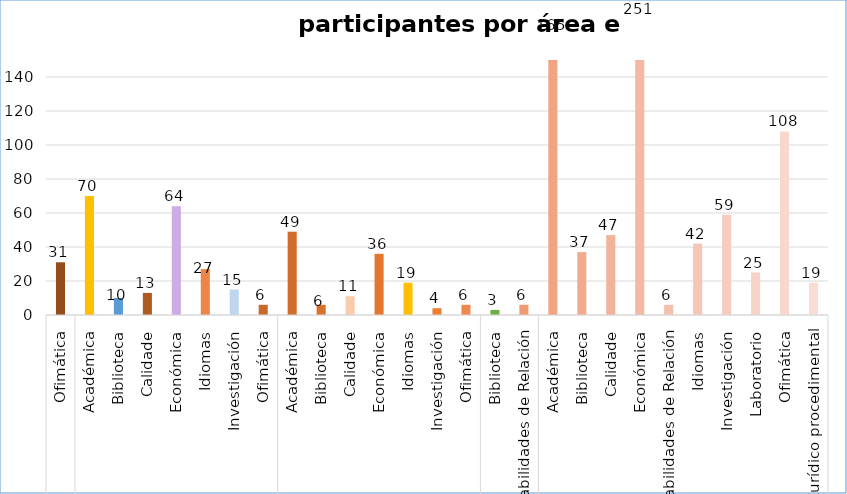
| Category | Series 0 |
|---|---|
| 0 | 31 |
| 1 | 70 |
| 2 | 10 |
| 3 | 13 |
| 4 | 64 |
| 5 | 27 |
| 6 | 15 |
| 7 | 6 |
| 8 | 49 |
| 9 | 6 |
| 10 | 11 |
| 11 | 36 |
| 12 | 19 |
| 13 | 4 |
| 14 | 6 |
| 15 | 3 |
| 16 | 6 |
| 17 | 165 |
| 18 | 37 |
| 19 | 47 |
| 20 | 251 |
| 21 | 6 |
| 22 | 42 |
| 23 | 59 |
| 24 | 25 |
| 25 | 108 |
| 26 | 19 |